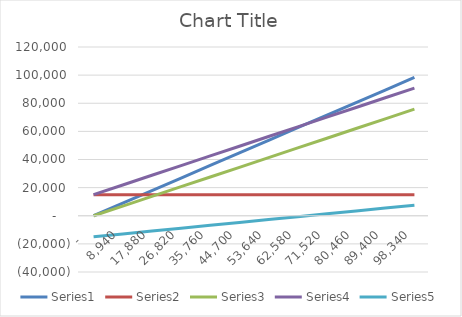
| Category | Series 0 | Series 1 | Series 2 | Series 3 | Series 4 |
|---|---|---|---|---|---|
| 0.0 | 0 | 15000 | 0 | 15000 | -15000 |
| 8940.0 | 8940 | 15000 | 6890.2 | 21890.2 | -12950.2 |
| 17880.0 | 17880 | 15000 | 13780.4 | 28780.4 | -10900.4 |
| 26820.0 | 26820 | 15000 | 20670.6 | 35670.6 | -8850.6 |
| 35760.0 | 35760 | 15000 | 27560.8 | 42560.8 | -6800.8 |
| 44700.0 | 44700 | 15000 | 34451 | 49451 | -4751 |
| 53640.0 | 53640 | 15000 | 41341.2 | 56341.2 | -2701.2 |
| 62580.0 | 62580 | 15000 | 48231.4 | 63231.4 | -651.4 |
| 71520.0 | 71520 | 15000 | 55121.6 | 70121.6 | 1398.4 |
| 80460.0 | 80460 | 15000 | 62011.8 | 77011.8 | 3448.2 |
| 89400.0 | 89400 | 15000 | 68902 | 83902 | 5498 |
| 98340.0 | 98340 | 15000 | 75792.2 | 90792.2 | 7547.8 |